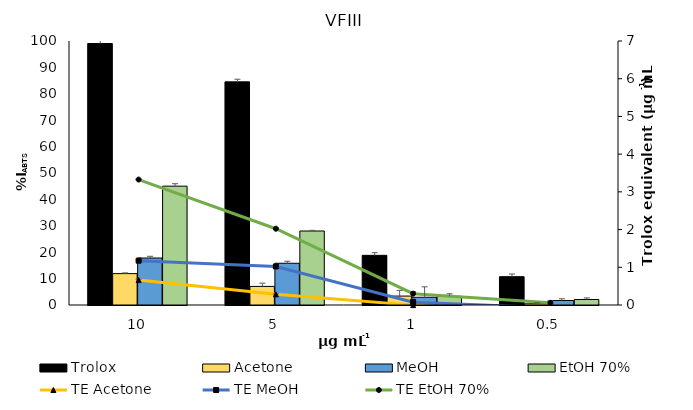
| Category | Trolox | Acetone | MeOH | EtOH 70% |
|---|---|---|---|---|
| 10.0 | 99.04 | 11.888 | 17.796 | 45.019 |
| 5.0 | 84.52 | 7.042 | 15.814 | 28.026 |
| 1.0 | 18.81 | 3.384 | 2.929 | 3.27 |
| 0.5 | 10.73 | 0.457 | 1.706 | 2.087 |